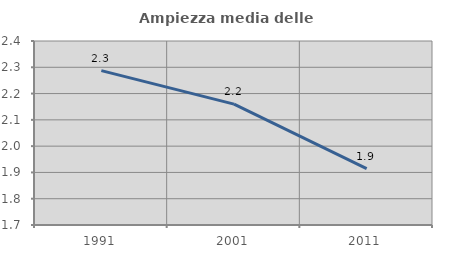
| Category | Ampiezza media delle famiglie |
|---|---|
| 1991.0 | 2.287 |
| 2001.0 | 2.16 |
| 2011.0 | 1.914 |